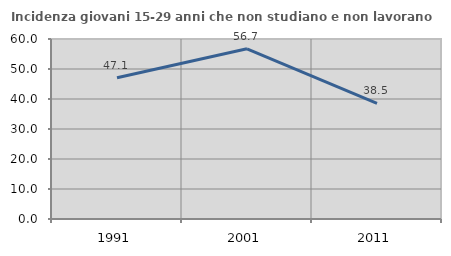
| Category | Incidenza giovani 15-29 anni che non studiano e non lavorano  |
|---|---|
| 1991.0 | 47.059 |
| 2001.0 | 56.733 |
| 2011.0 | 38.514 |